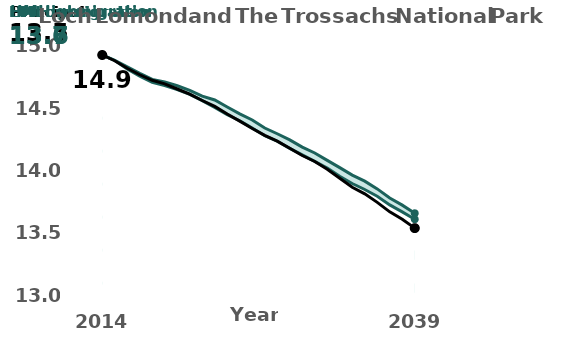
| Category |  High migration |  Low migration  |  Principal |
|---|---|---|---|
| 2014.0 | 14.928 | 14.928 | 14.928 |
| 2015.0 | 14.886 | 14.884 | 14.882 |
| 2016.0 | 14.833 | 14.816 | 14.822 |
| 2017.0 | 14.781 | 14.758 | 14.77 |
| 2018.0 | 14.733 | 14.71 | 14.726 |
| 2019.0 | 14.713 | 14.683 | 14.697 |
| 2020.0 | 14.682 | 14.651 | 14.656 |
| 2021.0 | 14.645 | 14.613 | 14.615 |
| 2022.0 | 14.599 | 14.563 | 14.564 |
| 2023.0 | 14.568 | 14.508 | 14.517 |
| 2024.0 | 14.512 | 14.45 | 14.456 |
| 2025.0 | 14.457 | 14.402 | 14.399 |
| 2026.0 | 14.408 | 14.344 | 14.34 |
| 2027.0 | 14.344 | 14.282 | 14.285 |
| 2028.0 | 14.298 | 14.238 | 14.239 |
| 2029.0 | 14.249 | 14.181 | 14.182 |
| 2030.0 | 14.191 | 14.129 | 14.124 |
| 2031.0 | 14.144 | 14.077 | 14.076 |
| 2032.0 | 14.085 | 14.023 | 14.014 |
| 2033.0 | 14.027 | 13.958 | 13.942 |
| 2034.0 | 13.967 | 13.9 | 13.87 |
| 2035.0 | 13.919 | 13.852 | 13.817 |
| 2036.0 | 13.857 | 13.798 | 13.749 |
| 2037.0 | 13.784 | 13.729 | 13.673 |
| 2038.0 | 13.727 | 13.673 | 13.614 |
| 2039.0 | 13.662 | 13.614 | 13.543 |